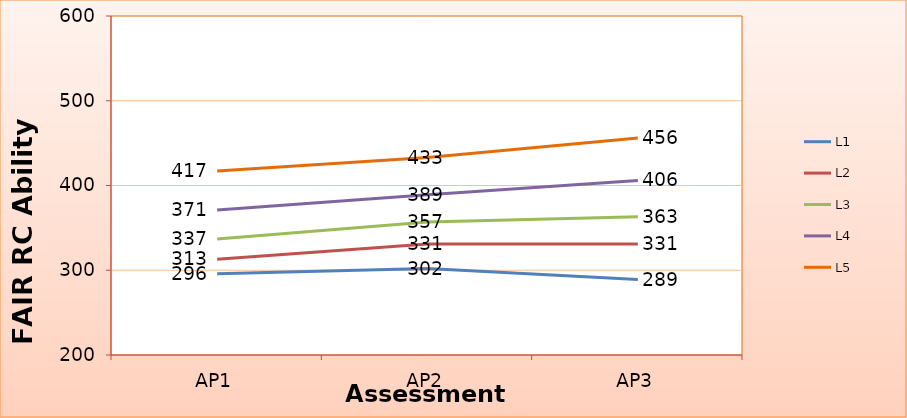
| Category | L1 | L2 | L3 | L4 | L5 |
|---|---|---|---|---|---|
| AP1 | 296 | 313 | 337 | 371 | 417 |
| AP2 | 302 | 331 | 357 | 389 | 433 |
| AP3 | 289 | 331 | 363 | 406 | 456 |